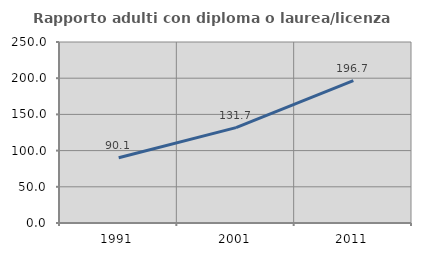
| Category | Rapporto adulti con diploma o laurea/licenza media  |
|---|---|
| 1991.0 | 90.052 |
| 2001.0 | 131.694 |
| 2011.0 | 196.737 |